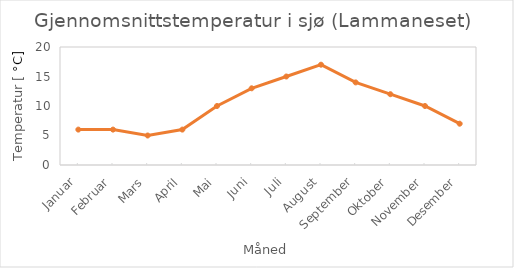
| Category | Series 0 |
|---|---|
| Januar | 6 |
| Februar | 6 |
| Mars | 5 |
| April | 6 |
| Mai | 10 |
| Juni | 13 |
| Juli | 15 |
| August | 17 |
| September | 14 |
| Oktober | 12 |
| November | 10 |
| Desember | 7 |